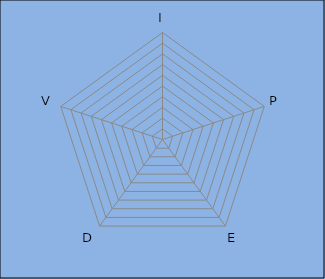
| Category | Series 0 |
|---|---|
| I | 0 |
| P | 0 |
| E | 0 |
| D | 0 |
| V | 0 |